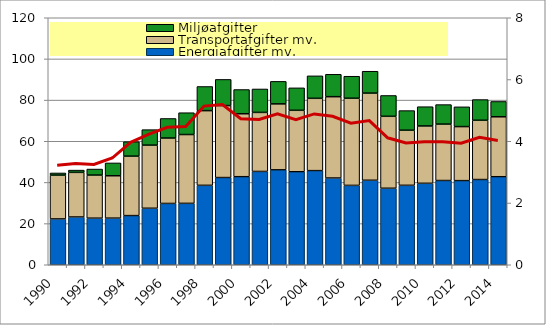
| Category | Energiafgifter mv. | Transportafgifter mv.  | Miljøafgifter |
|---|---|---|---|
| 1990-01-01 | 22.25 | 21.305 | 1.041 |
| 1991-01-01 | 23.199 | 21.689 | 1.091 |
| 1992-01-01 | 22.625 | 20.95 | 2.918 |
| 1993-01-01 | 22.641 | 20.602 | 6.221 |
| 1994-01-01 | 23.871 | 28.896 | 7.009 |
| 1995-01-01 | 27.443 | 30.677 | 7.517 |
| 1996-01-01 | 29.779 | 31.788 | 9.498 |
| 1997-01-01 | 29.823 | 33.442 | 10.604 |
| 1998-01-01 | 38.582 | 36.296 | 11.729 |
| 1999-01-01 | 42.353 | 34.985 | 12.704 |
| 2000-01-01 | 42.77 | 30.593 | 11.764 |
| 2001-01-01 | 45.322 | 28.694 | 11.379 |
| 2002-01-01 | 46.105 | 32.059 | 10.928 |
| 2003-01-01 | 45.175 | 29.871 | 10.9 |
| 2004-01-01 | 45.719 | 35.143 | 10.912 |
| 2005-01-01 | 42.131 | 39.52 | 10.878 |
| 2006-01-01 | 38.548 | 42.355 | 10.69 |
| 2007-01-01 | 41.052 | 42.336 | 10.632 |
| 2008-01-01 | 37.165 | 34.965 | 10.111 |
| 2009-01-01 | 38.591 | 26.776 | 9.531 |
| 2010-01-01 | 39.566 | 27.869 | 9.354 |
| 2011-01-01 | 40.913 | 27.424 | 9.476 |
| 2012-01-01 | 40.86 | 26.261 | 9.6 |
| 2013-01-01 | 41.393 | 28.808 | 10.049 |
| 2014-01-01 | 42.757 | 29.132 | 7.438 |